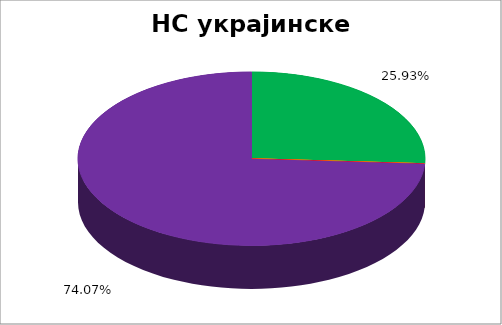
| Category | НС украјинске НМ |
|---|---|
| 0 | 0.259 |
| 1 | 0 |
| 2 | 0 |
| 3 | 0 |
| 4 | 0.741 |